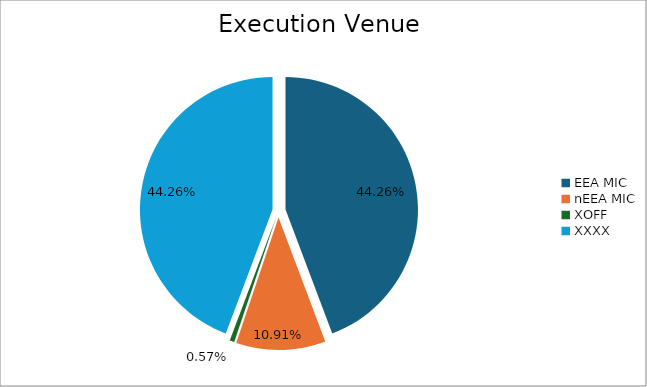
| Category | Series 0 |
|---|---|
| EEA MIC | 5773208.566 |
| nEEA MIC | 1423141.184 |
| XOFF | 74440.671 |
| XXXX | 5773541.24 |